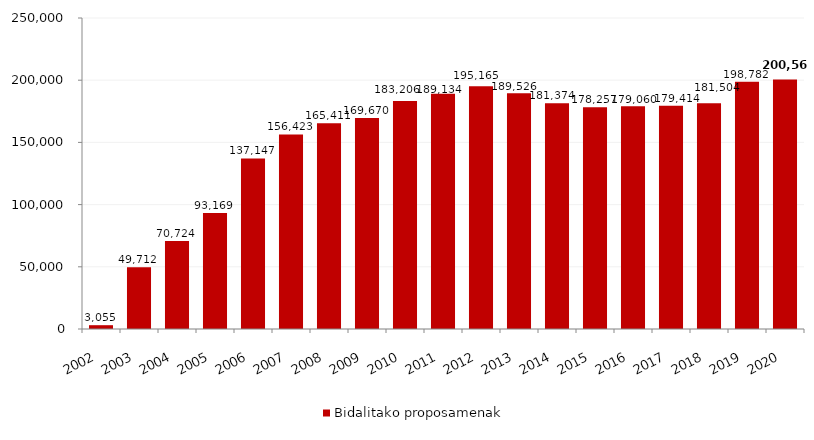
| Category | Bidalitako proposamenak |
|---|---|
| 2002.0 | 3055 |
| 2003.0 | 49712 |
| 2004.0 | 70724 |
| 2005.0 | 93169 |
| 2006.0 | 137147 |
| 2007.0 | 156423 |
| 2008.0 | 165411 |
| 2009.0 | 169670 |
| 2010.0 | 183206 |
| 2011.0 | 189134 |
| 2012.0 | 195165 |
| 2013.0 | 189526 |
| 2014.0 | 181374 |
| 2015.0 | 178257 |
| 2016.0 | 179060 |
| 2017.0 | 179414 |
| 2018.0 | 181504 |
| 2019.0 | 198782 |
| 2020.0 | 200561 |